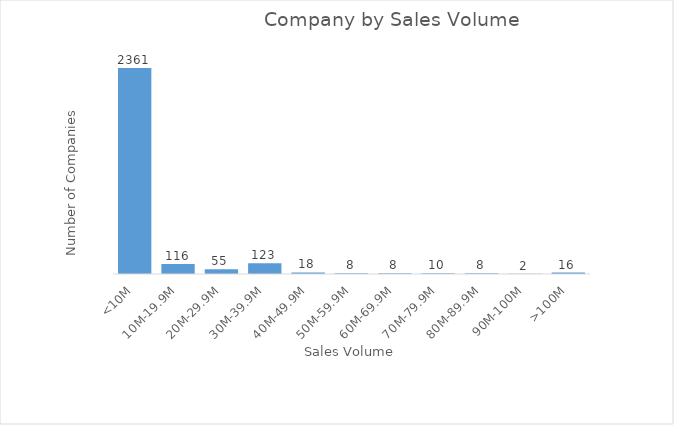
| Category | Total |
|---|---|
| >100M | 16 |
| 90M-100M | 2 |
| 80M-89.9M | 8 |
| 70M-79.9M | 10 |
| 60M-69.9M | 8 |
| 50M-59.9M | 8 |
| 40M-49.9M | 18 |
| 30M-39.9M | 123 |
| 20M-29.9M | 55 |
| 10M-19.9M | 116 |
| <10M | 2361 |